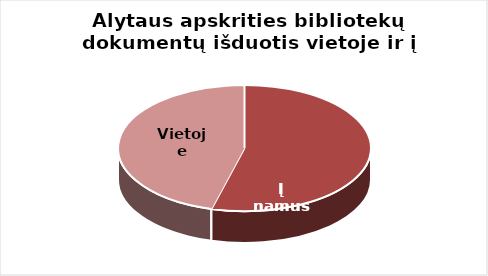
| Category | Series 0 |
|---|---|
| Į namus | 631608 |
| Vietoje | 533560 |